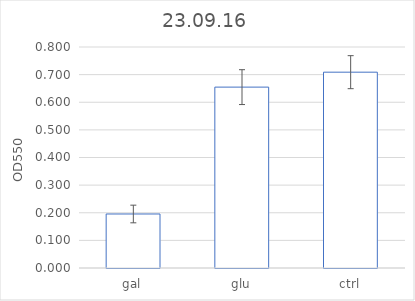
| Category | Series 0 |
|---|---|
| gal | 0.196 |
| glu | 0.655 |
| ctrl | 0.709 |